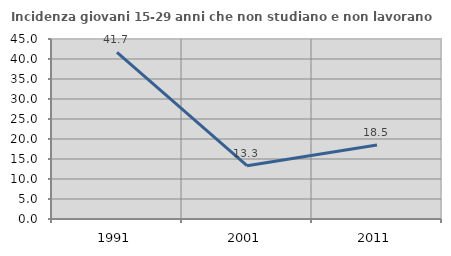
| Category | Incidenza giovani 15-29 anni che non studiano e non lavorano  |
|---|---|
| 1991.0 | 41.667 |
| 2001.0 | 13.325 |
| 2011.0 | 18.486 |